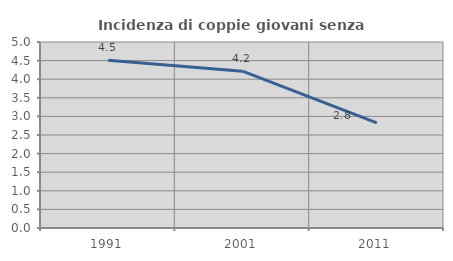
| Category | Incidenza di coppie giovani senza figli |
|---|---|
| 1991.0 | 4.509 |
| 2001.0 | 4.216 |
| 2011.0 | 2.823 |